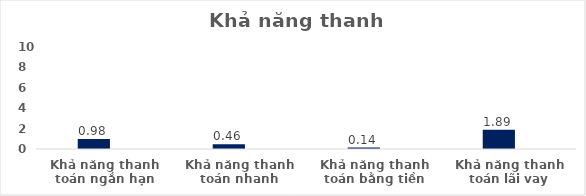
| Category | Series 0 | Series 1 | Series 2 | Series 3 | Series 4 | Series 5 |
|---|---|---|---|---|---|---|
| Khả năng thanh toán ngắn hạn | 0 | 0.983 |  |  |  |  |
| Khả năng thanh toán nhanh | 0 | 0.462 |  |  |  |  |
| Khả năng thanh toán bằng tiền | 0 | 0.141 |  |  |  |  |
| Khả năng thanh toán lãi vay | 0 | 1.894 |  |  |  |  |